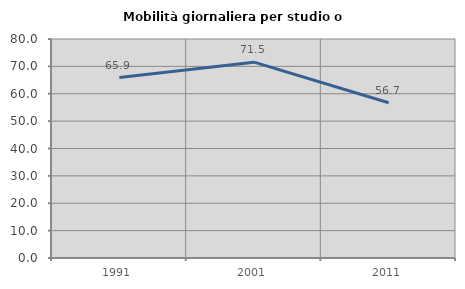
| Category | Mobilità giornaliera per studio o lavoro |
|---|---|
| 1991.0 | 65.934 |
| 2001.0 | 71.533 |
| 2011.0 | 56.707 |